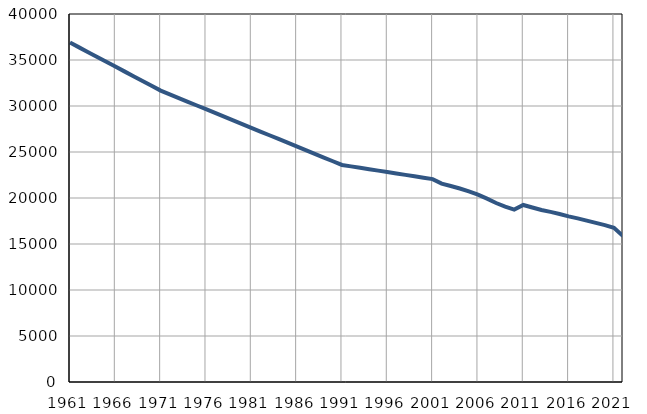
| Category | Број
становника |
|---|---|
| 1961.0 | 36896 |
| 1962.0 | 36374 |
| 1963.0 | 35851 |
| 1964.0 | 35328 |
| 1965.0 | 34806 |
| 1966.0 | 34284 |
| 1967.0 | 33762 |
| 1968.0 | 33239 |
| 1969.0 | 32717 |
| 1970.0 | 32194 |
| 1971.0 | 31672 |
| 1972.0 | 31267 |
| 1973.0 | 30864 |
| 1974.0 | 30459 |
| 1975.0 | 30055 |
| 1976.0 | 29650 |
| 1977.0 | 29246 |
| 1978.0 | 28842 |
| 1979.0 | 28438 |
| 1980.0 | 28034 |
| 1981.0 | 27629 |
| 1982.0 | 27225 |
| 1983.0 | 26821 |
| 1984.0 | 26417 |
| 1985.0 | 26014 |
| 1986.0 | 25610 |
| 1987.0 | 25206 |
| 1988.0 | 24801 |
| 1989.0 | 24398 |
| 1990.0 | 23994 |
| 1991.0 | 23590 |
| 1992.0 | 23436 |
| 1993.0 | 23282 |
| 1994.0 | 23128 |
| 1995.0 | 22974 |
| 1996.0 | 22820 |
| 1997.0 | 22667 |
| 1998.0 | 22513 |
| 1999.0 | 22359 |
| 2000.0 | 22205 |
| 2001.0 | 22051 |
| 2002.0 | 21562 |
| 2003.0 | 21308 |
| 2004.0 | 21036 |
| 2005.0 | 20730 |
| 2006.0 | 20361 |
| 2007.0 | 19930 |
| 2008.0 | 19452 |
| 2009.0 | 19056 |
| 2010.0 | 18740 |
| 2011.0 | 19243 |
| 2012.0 | 18963 |
| 2013.0 | 18694 |
| 2014.0 | 18488 |
| 2015.0 | 18262 |
| 2016.0 | 18006 |
| 2017.0 | 17787 |
| 2018.0 | 17545 |
| 2019.0 | 17290 |
| 2020.0 | 17051 |
| 2021.0 | 16757 |
| 2022.0 | 15869 |